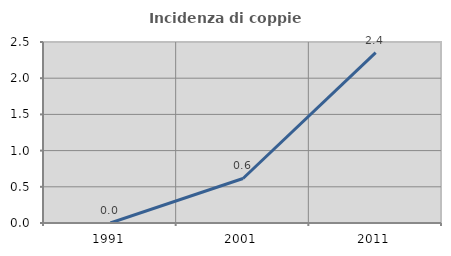
| Category | Incidenza di coppie miste |
|---|---|
| 1991.0 | 0 |
| 2001.0 | 0.615 |
| 2011.0 | 2.353 |